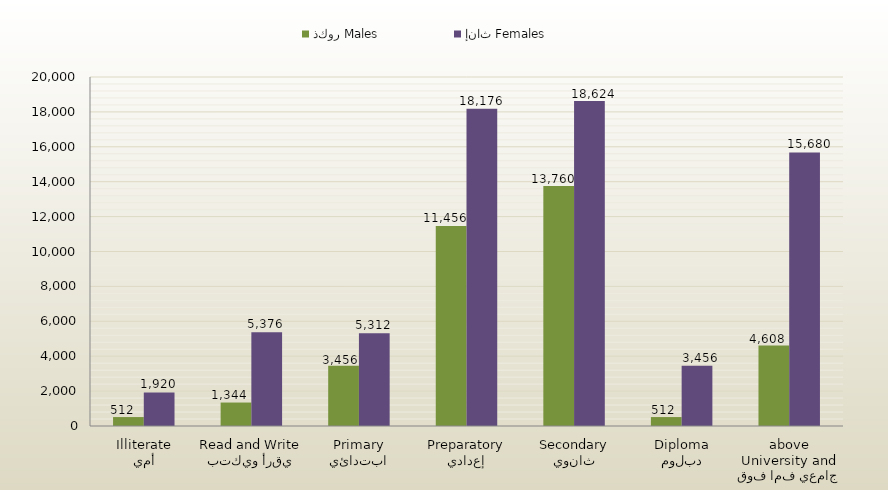
| Category | ذكور Males | إناث Females |
|---|---|---|
| أمي
Illiterate | 512 | 1920 |
| يقرأ ويكتب
Read and Write | 1344 | 5376 |
| ابتدائي
Primary | 3456 | 5312 |
| إعدادي
Preparatory | 11456 | 18176 |
| ثانوي
Secondary | 13760 | 18624 |
| دبلوم
Diploma | 512 | 3456 |
| جامعي فما فوق
University and above | 4608 | 15680 |